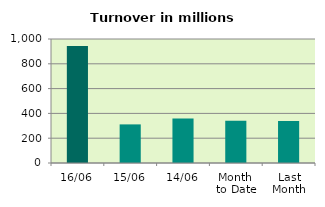
| Category | Series 0 |
|---|---|
| 16/06 | 943.754 |
| 15/06 | 311.366 |
| 14/06 | 358.233 |
| Month 
to Date | 340.743 |
| Last
Month | 338.969 |